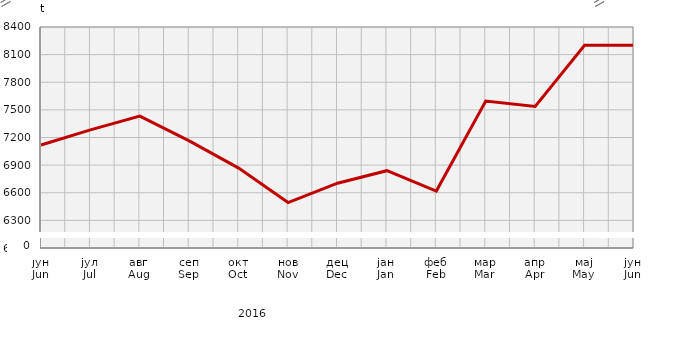
| Category | Прикупљање крављег млијека
Collecting of cow’s milk |
|---|---|
| јун
Jun | 7118.2 |
| јул
Jul | 7282.65 |
| авг
Aug | 7431.863 |
| сеп
Sep | 7163.964 |
| окт
Oct | 6867.986 |
| нов
Nov | 6493.2 |
| дец
Dec | 6703.986 |
| јан
Jan | 6839.677 |
| феб
Feb | 6618.5 |
| мар
Mar | 7595.98 |
| апр
Apr | 7537.768 |
| мај
May | 8202.4 |
| јун
Jun | 8202.4 |